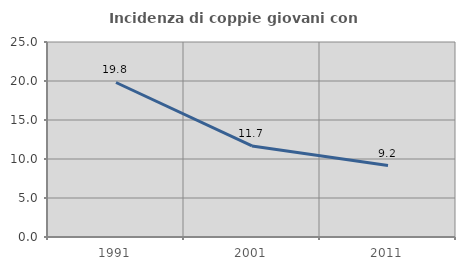
| Category | Incidenza di coppie giovani con figli |
|---|---|
| 1991.0 | 19.809 |
| 2001.0 | 11.679 |
| 2011.0 | 9.158 |